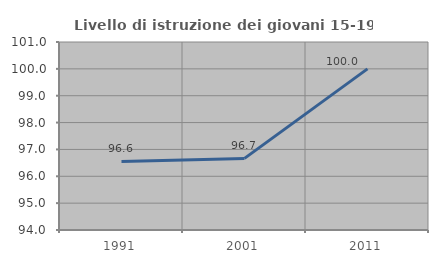
| Category | Livello di istruzione dei giovani 15-19 anni |
|---|---|
| 1991.0 | 96.552 |
| 2001.0 | 96.667 |
| 2011.0 | 100 |